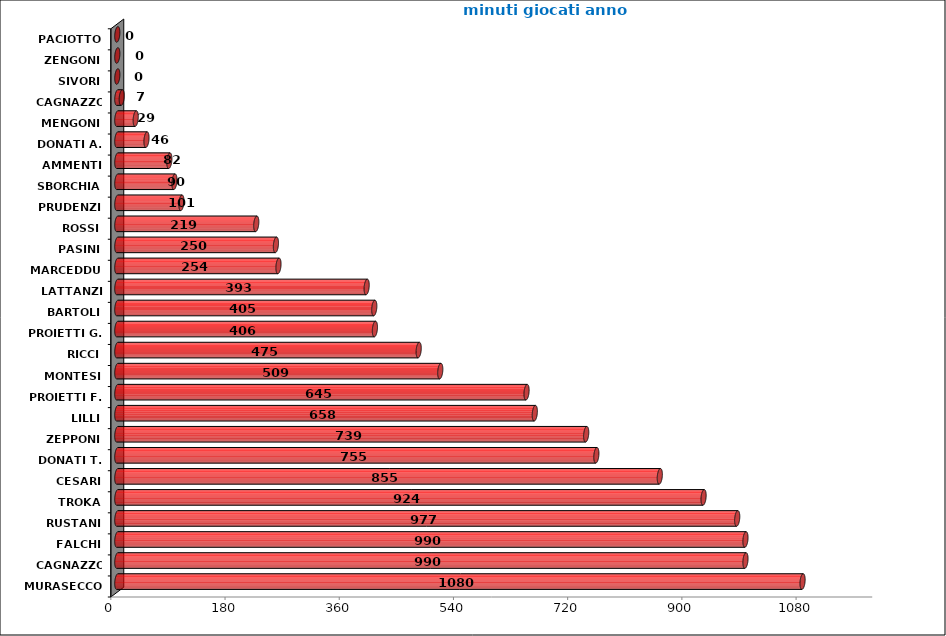
| Category | Series 0 |
|---|---|
| MURASECCO | 1080 |
| CAGNAZZO D. | 990 |
| FALCHI | 990 |
| RUSTANI | 977 |
| TROKA | 924 |
| CESARI | 855 |
| DONATI T. | 755 |
| ZEPPONI | 739 |
| LILLI | 658 |
| PROIETTI F. | 645 |
| MONTESI | 509 |
| RICCI | 475 |
| PROIETTI G. | 406 |
| BARTOLI | 405 |
| LATTANZI | 393 |
| MARCEDDU | 254 |
| PASINI | 250 |
| ROSSI | 219 |
| PRUDENZI | 101 |
| SBORCHIA | 90 |
| AMMENTI | 82 |
| DONATI A. | 46 |
| MENGONI | 29 |
| CAGNAZZO F. | 7 |
| SIVORI | 0 |
| ZENGONI | 0 |
| PACIOTTO | 0 |